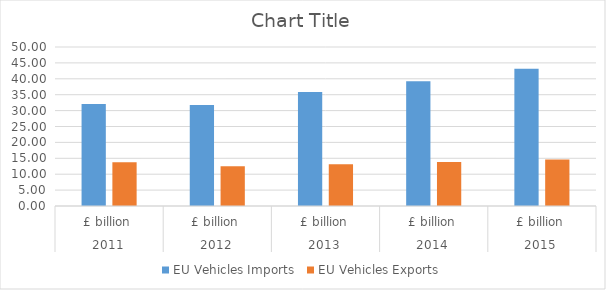
| Category | EU Vehicles Imports  | EU Vehicles Exports |
|---|---|---|
| 0 | 32.095 | 13.797 |
| 1 | 31.758 | 12.53 |
| 2 | 35.821 | 13.143 |
| 3 | 39.265 | 13.863 |
| 4 | 43.155 | 14.647 |